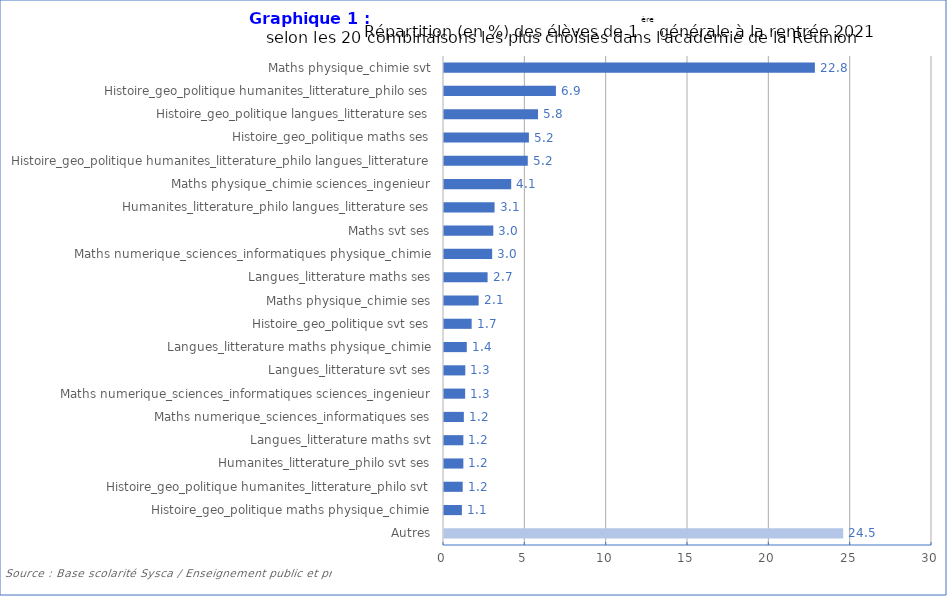
| Category | Series 1 |
|---|---|
| Autres | 24.539 |
| Histoire_geo_politique maths physique_chimie | 1.1 |
| Histoire_geo_politique humanites_litterature_philo svt | 1.15 |
| Humanites_litterature_philo svt ses | 1.19 |
| Langues_litterature maths svt | 1.19 |
| Maths numerique_sciences_informatiques ses | 1.22 |
| Maths numerique_sciences_informatiques sciences_ingenieur | 1.3 |
| Langues_litterature svt ses | 1.31 |
| Langues_litterature maths physique_chimie | 1.4 |
| Histoire_geo_politique svt ses | 1.7 |
| Maths physique_chimie ses | 2.13 |
| Langues_litterature maths ses | 2.68 |
| Maths numerique_sciences_informatiques physique_chimie | 2.96 |
| Maths svt ses | 3.03 |
| Humanites_litterature_philo langues_litterature ses | 3.11 |
| Maths physique_chimie sciences_ingenieur | 4.13 |
| Histoire_geo_politique humanites_litterature_philo langues_litterature | 5.15 |
| Histoire_geo_politique maths ses | 5.22 |
| Histoire_geo_politique langues_litterature ses | 5.78 |
| Histoire_geo_politique humanites_litterature_philo ses | 6.88 |
| Maths physique_chimie svt | 22.8 |